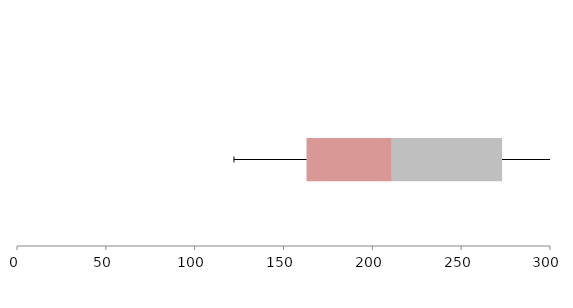
| Category | Series 1 | Series 2 | Series 3 |
|---|---|---|---|
| 0 | 162.957 | 48.013 | 62.06 |